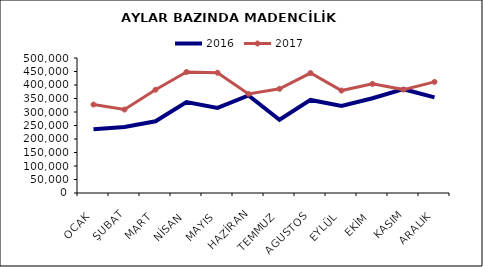
| Category | 2016 | 2017 |
|---|---|---|
| OCAK | 236204.636 | 327636.032 |
| ŞUBAT | 244178.069 | 309155.177 |
| MART | 265568.229 | 382542.66 |
| NİSAN | 337034.798 | 447992.117 |
| MAYIS | 315280.372 | 445508.963 |
| HAZİRAN | 361234.934 | 366962.57 |
| TEMMUZ | 271362.799 | 385891.367 |
| AGUSTOS | 344705.86 | 444210.276 |
| EYLÜL | 322012.035 | 379294.923 |
| EKİM | 351089.667 | 404231.468 |
| KASIM | 384469.139 | 382981.876 |
| ARALIK | 354103.231 | 411603.089 |